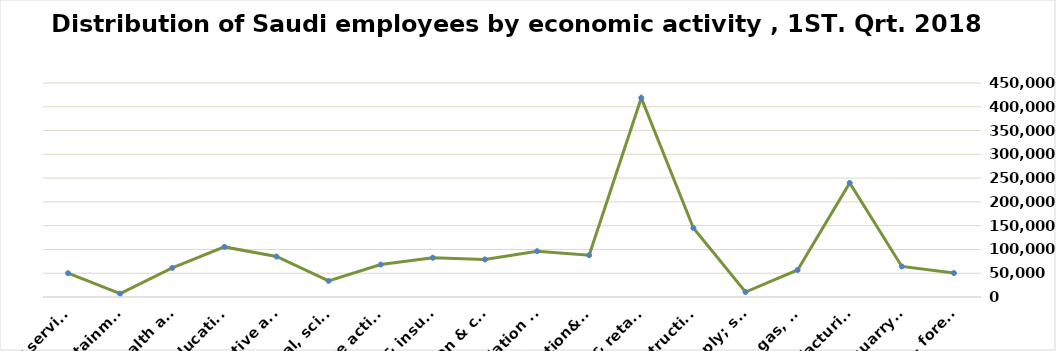
| Category | Series 0 |
|---|---|
| Agriculture, forestry & fishing | 50280 |
| Mining & quarrying | 64200 |
| Manufacturing | 239912 |
| Electricity, gas, steam & air conditioning supply | 56829 |
| Water supply; sewerage, waste remediation  | 10476 |
| Construction | 145149 |
| Wholesale& retail trade; repair of motor vehicles | 418622 |
| Transportation& storage | 87858 |
| Accommodation & food service activities | 96335 |
| Information & communication | 78978 |
| Financial & insurance | 82510 |
| Real estate activities | 68210 |
| Professional, scientific & technical activities | 33891 |
| Administrative and support service activities | 85135 |
| Education | 105317 |
| Human health and &l work activities | 61209 |
| Arts, entertainment & recreation | 7049 |
| Other service | 50073 |